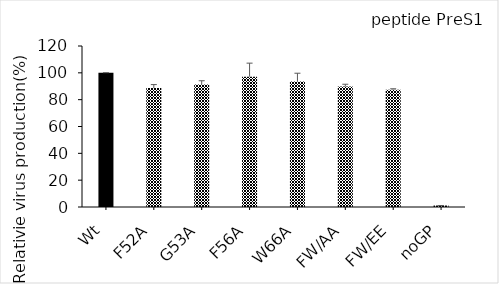
| Category | Series 0 |
|---|---|
| Wt | 100.053 |
| F52A | 88.613 |
| G53A | 91.222 |
| F56A | 97.137 |
| W66A | 93.601 |
| FW/AA | 89.778 |
| FW/EE | 87.466 |
| noGP | 1.102 |